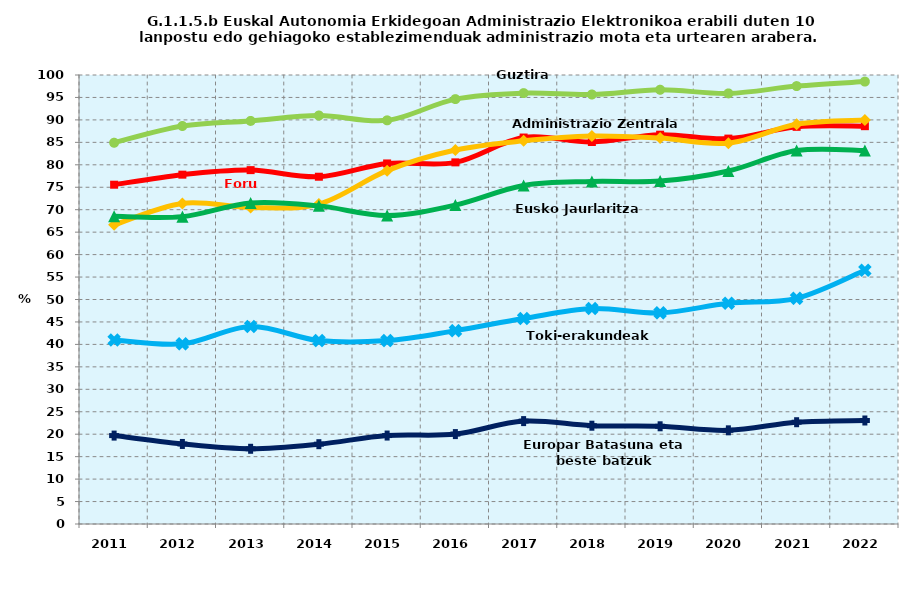
| Category | Guztira | Foru aldundiak | Administrazio Zentrala | Eusko Jaurlaritza | Toki-erakundeak | Europar Batasuna eta beste batzuk |
|---|---|---|---|---|---|---|
| 2011.0 | 84.919 | 75.566 | 66.635 | 68.518 | 40.99 | 19.69 |
| 2012.0 | 88.639 | 77.803 | 71.399 | 68.457 | 40.12 | 17.825 |
| 2013.0 | 89.774 | 78.814 | 70.5 | 71.513 | 43.99 | 16.752 |
| 2014.0 | 90.972 | 77.343 | 71.245 | 70.852 | 40.845 | 17.779 |
| 2015.0 | 89.9 | 80.3 | 78.7 | 68.7 | 40.845 | 19.7 |
| 2016.0 | 94.63 | 80.543 | 83.285 | 71.025 | 43.062 | 20.023 |
| 2017.0 | 95.964 | 86.074 | 85.341 | 75.396 | 45.758 | 22.918 |
| 2018.0 | 95.655 | 85.076 | 86.41 | 76.28 | 48.003 | 21.89 |
| 2019.0 | 96.71 | 86.706 | 85.942 | 76.372 | 47.022 | 21.763 |
| 2020.0 | 95.9 | 85.833 | 84.824 | 78.619 | 49.153 | 20.862 |
| 2021.0 | 97.529 | 88.456 | 89.021 | 83.165 | 50.257 | 22.668 |
| 2022.0 | 98.531 | 88.602 | 89.957 | 83.165 | 56.505 | 23.053 |